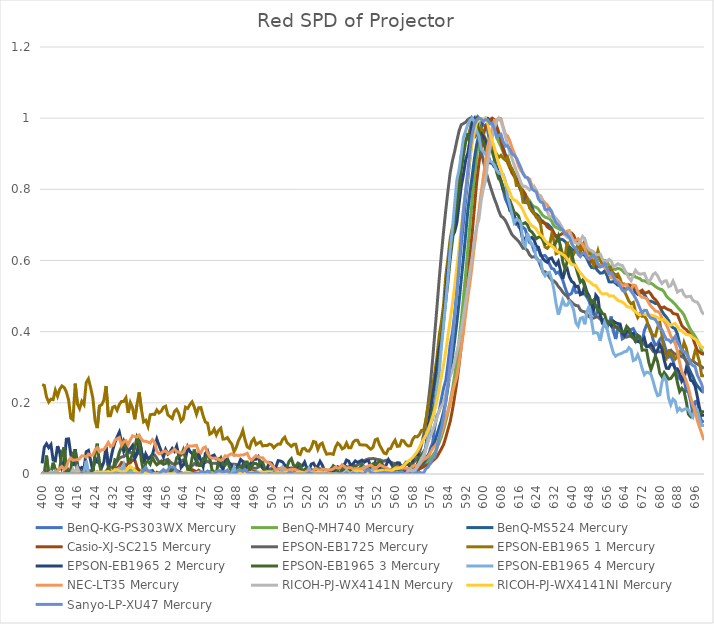
| Category | BenQ-KG-PS303WX | BenQ-MH740 | BenQ-MS524 | Casio-XJ-SC215 | EPSON-EB1725 | EPSON-EB1965 1 | EPSON-EB1965 2 | EPSON-EB1965 3 | EPSON-EB1965 4 | NEC-LT35 | RICOH-PJ-WX4141N | RICOH-PJ-WX4141NI | Sanyo-LP-XU47 |
|---|---|---|---|---|---|---|---|---|---|---|---|---|---|
| 400.0 | 0 | 0 | 0 | 0 | 0 | 0.251 | 0.03 | 0 | 0 | 0.006 | 0 | 0 | 0 |
| 401.0 | 0 | 0 | 0 | 0.001 | 0.006 | 0.249 | 0.076 | 0.003 | 0 | 0 | 0 | 0 | 0 |
| 402.0 | 0 | 0 | 0 | 0 | 0.008 | 0.217 | 0.085 | 0.052 | 0 | 0 | 0 | 0 | 0 |
| 403.0 | 0 | 0 | 0 | 0 | 0.006 | 0.202 | 0.074 | 0 | 0 | 0 | 0 | 0 | 0 |
| 404.0 | 0 | 0 | 0 | 0 | 0.002 | 0.21 | 0.083 | 0.004 | 0 | 0.003 | 0.007 | 0 | 0 |
| 405.0 | 0 | 0 | 0 | 0 | 0 | 0.209 | 0.039 | 0.032 | 0 | 0.004 | 0 | 0 | 0 |
| 406.0 | 0 | 0.005 | 0 | 0 | 0 | 0.235 | 0.037 | 0.012 | 0.009 | 0.004 | 0 | 0 | 0 |
| 407.0 | 0 | 0.003 | 0 | 0 | 0 | 0.219 | 0.078 | 0.009 | 0 | 0.007 | 0 | 0 | 0 |
| 408.0 | 0 | 0 | 0 | 0 | 0 | 0.238 | 0.06 | 0.015 | 0 | 0.016 | 0 | 0 | 0 |
| 409.0 | 0 | 0 | 0 | 0 | 0 | 0.248 | 0.018 | 0.06 | 0 | 0.021 | 0 | 0.001 | 0 |
| 410.0 | 0 | 0.005 | 0 | 0.003 | 0.002 | 0.243 | 0.03 | 0.075 | 0 | 0.013 | 0 | 0 | 0 |
| 411.0 | 0 | 0.01 | 0 | 0.006 | 0.005 | 0.231 | 0.098 | 0.009 | 0 | 0.019 | 0 | 0 | 0 |
| 412.0 | 0 | 0.002 | 0 | 0.006 | 0.013 | 0.208 | 0.099 | 0.005 | 0 | 0.038 | 0 | 0 | 0 |
| 413.0 | 0 | 0 | 0 | 0.001 | 0.006 | 0.157 | 0.056 | 0.011 | 0 | 0.044 | 0 | 0 | 0 |
| 414.0 | 0 | 0 | 0 | 0.001 | 0.008 | 0.152 | 0.022 | 0.059 | 0 | 0.038 | 0.013 | 0 | 0 |
| 415.0 | 0 | 0.001 | 0 | 0.006 | 0.006 | 0.254 | 0.07 | 0.063 | 0 | 0.04 | 0.001 | 0 | 0 |
| 416.0 | 0 | 0.009 | 0 | 0 | 0.005 | 0.197 | 0.023 | 0.001 | 0 | 0.04 | 0.018 | 0.003 | 0 |
| 417.0 | 0 | 0.009 | 0 | 0 | 0.004 | 0.184 | 0.014 | 0 | 0 | 0.043 | 0.003 | 0.002 | 0 |
| 418.0 | 0 | 0.003 | 0 | 0.009 | 0 | 0.204 | 0.019 | 0 | 0 | 0.051 | 0 | 0.002 | 0.003 |
| 419.0 | 0 | 0 | 0 | 0.012 | 0 | 0.195 | 0.014 | 0.001 | 0.007 | 0.051 | 0 | 0 | 0 |
| 420.0 | 0 | 0.005 | 0 | 0.008 | 0.005 | 0.257 | 0.062 | 0.025 | 0.037 | 0.047 | 0 | 0 | 0 |
| 421.0 | 0 | 0.007 | 0 | 0.004 | 0.004 | 0.268 | 0.066 | 0.009 | 0 | 0.056 | 0 | 0 | 0 |
| 422.0 | 0 | 0.009 | 0 | 0.001 | 0.009 | 0.243 | 0.037 | 0.005 | 0 | 0.052 | 0 | 0 | 0 |
| 423.0 | 0 | 0.007 | 0 | 0 | 0.004 | 0.214 | 0.009 | 0.007 | 0 | 0.053 | 0 | 0 | 0 |
| 424.0 | 0 | 0.004 | 0 | 0 | 0 | 0.151 | 0.046 | 0.056 | 0 | 0.067 | 0 | 0.005 | 0 |
| 425.0 | 0 | 0.007 | 0 | 0 | 0.001 | 0.129 | 0.033 | 0.085 | 0 | 0.074 | 0 | 0.006 | 0 |
| 426.0 | 0 | 0.002 | 0 | 0.002 | 0.005 | 0.191 | 0.032 | 0.027 | 0.001 | 0.063 | 0 | 0.005 | 0 |
| 427.0 | 0 | 0 | 0 | 0 | 0.002 | 0.194 | 0.018 | 0.002 | 0 | 0.068 | 0 | 0.006 | 0 |
| 428.0 | 0 | 0.001 | 0 | 0 | 0.001 | 0.208 | 0.034 | 0 | 0 | 0.068 | 0 | 0.005 | 0 |
| 429.0 | 0 | 0.009 | 0 | 0.004 | 0.004 | 0.247 | 0.076 | 0 | 0 | 0.078 | 0 | 0.006 | 0 |
| 430.0 | 0 | 0.008 | 0.001 | 0.005 | 0.015 | 0.164 | 0.021 | 0.018 | 0 | 0.089 | 0 | 0.007 | 0 |
| 431.0 | 0 | 0.005 | 0 | 0.001 | 0.02 | 0.164 | 0.039 | 0.005 | 0 | 0.077 | 0 | 0.005 | 0 |
| 432.0 | 0 | 0.006 | 0 | 0.006 | 0.018 | 0.188 | 0.067 | 0.006 | 0 | 0.08 | 0 | 0.007 | 0 |
| 433.0 | 0 | 0.006 | 0.002 | 0.015 | 0.022 | 0.19 | 0.089 | 0.04 | 0 | 0.095 | 0 | 0.012 | 0 |
| 434.0 | 0 | 0.006 | 0 | 0.017 | 0.036 | 0.179 | 0.104 | 0.038 | 0.012 | 0.099 | 0 | 0.012 | 0 |
| 435.0 | 0 | 0.008 | 0 | 0.021 | 0.044 | 0.195 | 0.118 | 0.061 | 0.016 | 0.102 | 0 | 0.009 | 0 |
| 436.0 | 0 | 0.005 | 0 | 0.032 | 0.048 | 0.204 | 0.09 | 0.076 | 0.011 | 0.08 | 0 | 0.006 | 0 |
| 437.0 | 0 | 0.003 | 0 | 0.03 | 0.049 | 0.204 | 0.064 | 0.093 | 0.027 | 0.09 | 0 | 0.005 | 0 |
| 438.0 | 0 | 0.005 | 0 | 0.023 | 0.053 | 0.214 | 0.078 | 0.078 | 0 | 0.094 | 0 | 0.009 | 0 |
| 439.0 | 0 | 0.011 | 0 | 0.03 | 0.058 | 0.171 | 0.064 | 0.036 | 0 | 0.082 | 0 | 0.016 | 0 |
| 440.0 | 0 | 0.01 | 0 | 0.032 | 0.061 | 0.201 | 0.071 | 0.04 | 0.005 | 0.096 | 0 | 0.021 | 0 |
| 441.0 | 0 | 0.01 | 0 | 0.039 | 0.058 | 0.186 | 0.08 | 0.057 | 0.002 | 0.107 | 0 | 0.016 | 0 |
| 442.0 | 0 | 0.014 | 0 | 0.04 | 0.058 | 0.154 | 0.043 | 0.072 | 0 | 0.105 | 0 | 0.01 | 0 |
| 443.0 | 0 | 0.015 | 0 | 0.02 | 0.06 | 0.194 | 0.055 | 0.104 | 0 | 0.104 | 0 | 0.004 | 0 |
| 444.0 | 0 | 0.012 | 0 | 0.007 | 0.059 | 0.229 | 0.098 | 0.092 | 0 | 0.109 | 0 | 0.002 | 0 |
| 445.0 | 0 | 0.006 | 0 | 0.002 | 0.054 | 0.182 | 0.067 | 0.038 | 0 | 0.098 | 0 | 0.004 | 0 |
| 446.0 | 0 | 0.004 | 0 | 0.002 | 0.054 | 0.147 | 0.029 | 0.005 | 0 | 0.092 | 0 | 0.003 | 0.011 |
| 447.0 | 0 | 0.004 | 0 | 0.01 | 0.047 | 0.151 | 0.056 | 0.031 | 0.003 | 0.092 | 0 | 0.003 | 0.019 |
| 448.0 | 0 | 0.003 | 0 | 0.006 | 0.043 | 0.134 | 0.043 | 0.036 | 0.009 | 0.09 | 0 | 0.003 | 0.008 |
| 449.0 | 0 | 0.009 | 0.005 | 0.005 | 0.048 | 0.167 | 0.045 | 0.027 | 0.007 | 0.087 | 0 | 0 | 0.007 |
| 450.0 | 0 | 0.01 | 0.009 | 0 | 0.055 | 0.168 | 0.053 | 0.047 | 0 | 0.096 | 0 | 0.001 | 0.001 |
| 451.0 | 0 | 0 | 0.001 | 0 | 0.054 | 0.168 | 0.078 | 0.034 | 0 | 0.09 | 0 | 0.002 | 0 |
| 452.0 | 0 | 0 | 0 | 0.005 | 0.044 | 0.18 | 0.098 | 0.026 | 0 | 0.064 | 0 | 0.002 | 0 |
| 453.0 | 0 | 0.003 | 0 | 0 | 0.034 | 0.172 | 0.08 | 0.031 | 0 | 0.057 | 0 | 0.001 | 0 |
| 454.0 | 0 | 0.006 | 0 | 0 | 0.031 | 0.176 | 0.065 | 0.036 | 0 | 0.058 | 0 | 0 | 0.006 |
| 455.0 | 0 | 0.007 | 0 | 0 | 0.037 | 0.187 | 0.048 | 0.027 | 0.001 | 0.064 | 0 | 0 | 0.013 |
| 456.0 | 0 | 0.005 | 0 | 0.001 | 0.039 | 0.191 | 0.069 | 0.029 | 0 | 0.065 | 0 | 0 | 0.007 |
| 457.0 | 0 | 0.003 | 0 | 0 | 0.041 | 0.166 | 0.056 | 0.037 | 0 | 0.057 | 0 | 0 | 0.011 |
| 458.0 | 0 | 0 | 0.001 | 0.005 | 0.034 | 0.161 | 0.062 | 0.015 | 0 | 0.059 | 0 | 0 | 0.021 |
| 459.0 | 0 | 0 | 0 | 0.014 | 0.029 | 0.156 | 0.072 | 0 | 0 | 0.064 | 0 | 0 | 0.019 |
| 460.0 | 0 | 0 | 0 | 0.003 | 0.028 | 0.175 | 0.064 | 0.018 | 0.006 | 0.07 | 0 | 0 | 0.019 |
| 461.0 | 0 | 0.005 | 0 | 0.01 | 0.03 | 0.182 | 0.079 | 0.046 | 0 | 0.064 | 0 | 0.001 | 0.008 |
| 462.0 | 0 | 0.006 | 0 | 0.007 | 0.031 | 0.17 | 0.051 | 0.051 | 0 | 0.061 | 0 | 0 | 0 |
| 463.0 | 0 | 0.005 | 0.001 | 0 | 0.036 | 0.148 | 0.018 | 0.053 | 0 | 0.058 | 0 | 0 | 0 |
| 464.0 | 0 | 0.001 | 0 | 0.001 | 0.04 | 0.156 | 0.026 | 0.068 | 0 | 0.06 | 0 | 0 | 0 |
| 465.0 | 0 | 0 | 0 | 0 | 0.026 | 0.188 | 0.043 | 0.043 | 0 | 0.072 | 0 | 0.005 | 0 |
| 466.0 | 0 | 0 | 0 | 0 | 0.022 | 0.184 | 0.076 | 0.012 | 0 | 0.079 | 0 | 0.005 | 0 |
| 467.0 | 0 | 0.005 | 0 | 0.004 | 0.022 | 0.195 | 0.063 | 0.009 | 0 | 0.078 | 0 | 0.004 | 0 |
| 468.0 | 0 | 0.007 | 0 | 0.012 | 0.022 | 0.203 | 0.057 | 0.046 | 0 | 0.079 | 0 | 0.001 | 0 |
| 469.0 | 0 | 0.006 | 0 | 0.009 | 0.029 | 0.188 | 0.048 | 0.069 | 0 | 0.079 | 0 | 0.001 | 0.002 |
| 470.0 | 0 | 0.004 | 0 | 0.006 | 0.025 | 0.168 | 0.035 | 0.041 | 0 | 0.081 | 0 | 0.003 | 0.003 |
| 471.0 | 0 | 0.003 | 0 | 0.01 | 0.029 | 0.186 | 0.057 | 0.024 | 0 | 0.064 | 0 | 0.005 | 0 |
| 472.0 | 0 | 0.005 | 0 | 0.006 | 0.028 | 0.187 | 0.037 | 0.024 | 0 | 0.059 | 0 | 0.004 | 0.007 |
| 473.0 | 0 | 0.006 | 0 | 0.002 | 0.029 | 0.163 | 0.021 | 0.042 | 0 | 0.073 | 0 | 0.003 | 0.005 |
| 474.0 | 0 | 0.005 | 0 | 0 | 0.032 | 0.146 | 0.058 | 0.04 | 0 | 0.076 | 0 | 0.002 | 0.003 |
| 475.0 | 0 | 0.006 | 0 | 0.002 | 0.036 | 0.143 | 0.065 | 0.055 | 0 | 0.059 | 0 | 0 | 0.008 |
| 476.0 | 0 | 0.007 | 0 | 0.001 | 0.032 | 0.112 | 0.045 | 0.046 | 0 | 0.049 | 0 | 0 | 0.002 |
| 477.0 | 0 | 0.008 | 0 | 0.001 | 0.03 | 0.116 | 0.05 | 0.012 | 0 | 0.044 | 0 | 0.003 | 0 |
| 478.0 | 0 | 0.007 | 0 | 0.002 | 0.03 | 0.126 | 0.053 | 0 | 0 | 0.044 | 0 | 0.001 | 0 |
| 479.0 | 0 | 0.003 | 0 | 0 | 0.03 | 0.11 | 0.042 | 0.003 | 0.001 | 0.045 | 0 | 0 | 0.006 |
| 480.0 | 0.002 | 0.003 | 0 | 0 | 0.025 | 0.122 | 0.043 | 0.037 | 0 | 0.041 | 0 | 0 | 0.01 |
| 481.0 | 0 | 0.009 | 0 | 0 | 0.021 | 0.129 | 0.028 | 0.046 | 0 | 0.038 | 0 | 0 | 0.008 |
| 482.0 | 0 | 0.008 | 0 | 0 | 0.028 | 0.098 | 0.012 | 0.027 | 0 | 0.042 | 0 | 0.001 | 0.005 |
| 483.0 | 0 | 0.005 | 0 | 0.001 | 0.029 | 0.099 | 0.038 | 0.025 | 0 | 0.051 | 0 | 0.001 | 0.007 |
| 484.0 | 0 | 0.004 | 0 | 0 | 0.03 | 0.102 | 0.043 | 0.037 | 0 | 0.05 | 0 | 0 | 0.011 |
| 485.0 | 0 | 0.004 | 0 | 0.001 | 0.029 | 0.092 | 0.029 | 0.018 | 0 | 0.055 | 0 | 0 | 0.001 |
| 486.0 | 0 | 0.005 | 0 | 0.003 | 0.027 | 0.084 | 0.025 | 0.007 | 0.003 | 0.057 | 0 | 0.001 | 0 |
| 487.0 | 0 | 0.007 | 0 | 0.004 | 0.028 | 0.063 | 0.005 | 0.011 | 0.018 | 0.052 | 0 | 0.001 | 0.002 |
| 488.0 | 0 | 0.007 | 0.001 | 0.006 | 0.027 | 0.074 | 0.015 | 0.011 | 0.002 | 0.053 | 0 | 0.002 | 0.004 |
| 489.0 | 0 | 0.004 | 0.006 | 0.006 | 0.025 | 0.094 | 0.026 | 0.019 | 0 | 0.052 | 0 | 0.004 | 0.011 |
| 490.0 | 0 | 0.002 | 0.006 | 0.006 | 0.023 | 0.106 | 0.041 | 0.021 | 0 | 0.053 | 0 | 0.003 | 0.01 |
| 491.0 | 0 | 0.007 | 0.007 | 0.008 | 0.024 | 0.122 | 0.036 | 0.011 | 0 | 0.053 | 0 | 0.002 | 0.007 |
| 492.0 | 0 | 0.007 | 0.007 | 0.01 | 0.023 | 0.096 | 0.006 | 0.034 | 0 | 0.055 | 0 | 0.003 | 0.013 |
| 493.0 | 0 | 0.006 | 0.004 | 0.008 | 0.025 | 0.076 | 0.024 | 0.034 | 0 | 0.058 | 0 | 0.003 | 0.006 |
| 494.0 | 0 | 0.005 | 0.005 | 0.008 | 0.022 | 0.072 | 0.025 | 0.014 | 0 | 0.044 | 0 | 0.004 | 0 |
| 495.0 | 0.001 | 0.006 | 0.007 | 0.01 | 0.016 | 0.091 | 0.034 | 0.021 | 0.006 | 0.039 | 0 | 0.004 | 0.002 |
| 496.0 | 0 | 0.008 | 0.006 | 0.006 | 0.017 | 0.099 | 0.041 | 0.03 | 0 | 0.046 | 0 | 0.003 | 0.001 |
| 497.0 | 0 | 0.007 | 0.003 | 0.005 | 0.016 | 0.083 | 0.042 | 0.029 | 0 | 0.052 | 0 | 0.001 | 0.005 |
| 498.0 | 0 | 0.005 | 0.002 | 0.002 | 0.019 | 0.087 | 0.049 | 0.024 | 0 | 0.048 | 0 | 0.004 | 0.003 |
| 499.0 | 0 | 0.003 | 0 | 0 | 0.023 | 0.09 | 0.029 | 0.036 | 0 | 0.045 | 0 | 0.007 | 0 |
| 500.0 | 0 | 0.002 | 0 | 0.003 | 0.017 | 0.079 | 0.017 | 0.032 | 0 | 0.046 | 0 | 0.005 | 0 |
| 501.0 | 0 | 0.004 | 0 | 0.001 | 0.013 | 0.08 | 0.007 | 0.015 | 0 | 0.038 | 0 | 0.005 | 0 |
| 502.0 | 0 | 0.004 | 0 | 0 | 0.012 | 0.08 | 0.016 | 0 | 0.003 | 0.033 | 0 | 0.006 | 0 |
| 503.0 | 0 | 0.005 | 0 | 0 | 0.013 | 0.084 | 0.032 | 0 | 0 | 0.031 | 0 | 0.006 | 0.002 |
| 504.0 | 0 | 0.007 | 0.001 | 0 | 0.015 | 0.082 | 0.03 | 0 | 0 | 0.025 | 0 | 0.004 | 0 |
| 505.0 | 0 | 0.006 | 0.005 | 0 | 0.015 | 0.074 | 0.018 | 0 | 0 | 0.019 | 0 | 0.002 | 0 |
| 506.0 | 0 | 0.004 | 0.001 | 0 | 0.013 | 0.08 | 0.02 | 0.003 | 0 | 0.011 | 0 | 0.003 | 0 |
| 507.0 | 0 | 0.004 | 0 | 0 | 0.015 | 0.084 | 0.038 | 0.009 | 0 | 0.012 | 0 | 0.004 | 0 |
| 508.0 | 0 | 0.003 | 0 | 0 | 0.015 | 0.084 | 0.037 | 0.014 | 0 | 0.016 | 0 | 0.002 | 0 |
| 509.0 | 0 | 0.001 | 0 | 0 | 0.013 | 0.097 | 0.034 | 0.003 | 0.019 | 0.016 | 0 | 0.002 | 0 |
| 510.0 | 0 | 0.002 | 0 | 0 | 0.014 | 0.103 | 0.025 | 0.009 | 0.003 | 0.015 | 0 | 0.004 | 0 |
| 511.0 | 0 | 0.004 | 0 | 0 | 0.012 | 0.089 | 0.02 | 0.02 | 0 | 0.01 | 0 | 0.005 | 0 |
| 512.0 | 0 | 0.003 | 0 | 0 | 0.016 | 0.083 | 0.014 | 0.036 | 0.002 | 0.012 | 0 | 0.004 | 0.004 |
| 513.0 | 0 | 0.003 | 0 | 0 | 0.017 | 0.077 | 0 | 0.043 | 0 | 0.013 | 0 | 0.003 | 0.003 |
| 514.0 | 0 | 0.003 | 0 | 0 | 0.015 | 0.083 | 0.003 | 0.024 | 0 | 0.013 | 0 | 0.003 | 0 |
| 515.0 | 0 | 0.004 | 0 | 0 | 0.017 | 0.084 | 0.015 | 0.021 | 0 | 0.012 | 0 | 0.003 | 0 |
| 516.0 | 0 | 0.005 | 0 | 0.001 | 0.016 | 0.057 | 0.024 | 0.031 | 0 | 0.008 | 0 | 0.005 | 0 |
| 517.0 | 0 | 0.003 | 0.001 | 0 | 0.01 | 0.055 | 0.022 | 0.027 | 0 | 0.006 | 0 | 0.005 | 0 |
| 518.0 | 0 | 0.001 | 0 | 0 | 0.007 | 0.071 | 0.023 | 0.004 | 0 | 0.005 | 0 | 0.004 | 0 |
| 519.0 | 0 | 0.003 | 0 | 0 | 0.008 | 0.072 | 0.033 | 0.013 | 0 | 0.004 | 0 | 0.002 | 0 |
| 520.0 | 0 | 0.004 | 0 | 0 | 0.012 | 0.065 | 0.016 | 0.017 | 0 | 0.008 | 0 | 0.003 | 0.001 |
| 521.0 | 0 | 0.002 | 0 | 0 | 0.014 | 0.064 | 0.011 | 0.012 | 0.016 | 0.006 | 0 | 0.005 | 0.004 |
| 522.0 | 0 | 0.002 | 0 | 0 | 0.012 | 0.074 | 0.028 | 0.008 | 0.005 | 0.004 | 0 | 0.004 | 0.002 |
| 523.0 | 0 | 0.003 | 0 | 0.001 | 0.011 | 0.091 | 0.03 | 0.006 | 0 | 0.009 | 0.001 | 0.002 | 0 |
| 524.0 | 0 | 0.004 | 0 | 0.001 | 0.012 | 0.089 | 0.02 | 0.017 | 0 | 0.016 | 0.003 | 0.003 | 0 |
| 525.0 | 0 | 0.004 | 0 | 0 | 0.016 | 0.069 | 0.022 | 0.004 | 0 | 0.012 | 0 | 0.005 | 0 |
| 526.0 | 0 | 0.002 | 0 | 0 | 0.015 | 0.083 | 0.035 | 0 | 0 | 0.009 | 0.004 | 0.004 | 0 |
| 527.0 | 0 | 0.002 | 0 | 0 | 0.011 | 0.087 | 0.025 | 0.011 | 0 | 0.013 | 0.004 | 0.003 | 0 |
| 528.0 | 0 | 0.004 | 0 | 0.001 | 0.011 | 0.069 | 0.009 | 0.003 | 0 | 0.013 | 0 | 0.004 | 0 |
| 529.0 | 0 | 0.005 | 0 | 0.004 | 0.011 | 0.056 | 0.001 | 0.002 | 0 | 0.011 | 0 | 0.003 | 0.001 |
| 530.0 | 0 | 0.004 | 0 | 0.002 | 0.01 | 0.057 | 0.007 | 0.002 | 0 | 0.012 | 0 | 0.002 | 0 |
| 531.0 | 0 | 0.004 | 0 | 0 | 0.012 | 0.057 | 0.014 | 0.013 | 0 | 0.012 | 0 | 0 | 0 |
| 532.0 | 0 | 0.004 | 0 | 0 | 0.013 | 0.055 | 0.003 | 0.023 | 0 | 0.014 | 0 | 0 | 0 |
| 533.0 | 0 | 0.003 | 0 | 0 | 0.015 | 0.076 | 0.017 | 0.019 | 0 | 0.02 | 0 | 0.001 | 0 |
| 534.0 | 0 | 0.003 | 0 | 0 | 0.018 | 0.087 | 0.02 | 0.008 | 0 | 0.017 | 0 | 0 | 0 |
| 535.0 | 0 | 0.004 | 0 | 0 | 0.017 | 0.081 | 0.017 | 0.003 | 0 | 0.017 | 0 | 0 | 0.002 |
| 536.0 | 0 | 0.004 | 0 | 0 | 0.016 | 0.071 | 0.024 | 0.012 | 0 | 0.026 | 0 | 0 | 0 |
| 537.0 | 0 | 0.004 | 0 | 0.001 | 0.022 | 0.074 | 0.026 | 0.01 | 0.002 | 0.021 | 0.003 | 0.003 | 0 |
| 538.0 | 0 | 0.006 | 0.001 | 0 | 0.02 | 0.087 | 0.039 | 0.019 | 0.005 | 0.016 | 0.01 | 0.005 | 0.004 |
| 539.0 | 0 | 0.007 | 0.004 | 0 | 0.019 | 0.073 | 0.036 | 0.014 | 0 | 0.018 | 0.001 | 0.003 | 0 |
| 540.0 | 0 | 0.008 | 0.003 | 0.001 | 0.026 | 0.074 | 0.022 | 0.012 | 0 | 0.018 | 0 | 0.002 | 0 |
| 541.0 | 0 | 0.006 | 0 | 0.002 | 0.025 | 0.089 | 0.029 | 0.02 | 0.003 | 0.014 | 0.001 | 0.006 | 0.003 |
| 542.0 | 0 | 0.004 | 0 | 0.001 | 0.023 | 0.095 | 0.037 | 0.021 | 0 | 0.015 | 0.002 | 0.008 | 0.001 |
| 543.0 | 0 | 0.006 | 0.005 | 0.001 | 0.025 | 0.095 | 0.033 | 0.014 | 0.001 | 0.015 | 0 | 0.008 | 0 |
| 544.0 | 0 | 0.007 | 0.008 | 0 | 0.029 | 0.082 | 0.036 | 0.016 | 0.004 | 0.014 | 0 | 0.008 | 0.002 |
| 545.0 | 0 | 0.006 | 0.004 | 0.002 | 0.034 | 0.082 | 0.039 | 0.027 | 0.015 | 0.016 | 0.007 | 0.006 | 0 |
| 546.0 | 0 | 0.005 | 0.002 | 0.008 | 0.037 | 0.081 | 0.033 | 0.02 | 0.02 | 0.017 | 0.002 | 0.004 | 0 |
| 547.0 | 0 | 0.005 | 0.005 | 0.009 | 0.041 | 0.081 | 0.037 | 0.014 | 0.001 | 0.019 | 0.003 | 0.003 | 0.011 |
| 548.0 | 0 | 0.006 | 0.007 | 0.009 | 0.043 | 0.075 | 0.037 | 0.014 | 0 | 0.023 | 0.001 | 0.006 | 0.012 |
| 549.0 | 0 | 0.007 | 0.008 | 0.004 | 0.043 | 0.07 | 0.02 | 0.022 | 0.004 | 0.025 | 0 | 0.006 | 0.004 |
| 550.0 | 0 | 0.007 | 0.008 | 0 | 0.044 | 0.075 | 0.019 | 0.029 | 0.014 | 0.02 | 0 | 0.005 | 0.002 |
| 551.0 | 0 | 0.008 | 0.007 | 0.004 | 0.042 | 0.096 | 0.033 | 0.028 | 0.014 | 0.016 | 0.006 | 0.007 | 0 |
| 552.0 | 0 | 0.01 | 0.01 | 0.005 | 0.041 | 0.099 | 0.021 | 0.031 | 0.003 | 0.02 | 0.002 | 0.008 | 0.002 |
| 553.0 | 0 | 0.009 | 0.009 | 0.003 | 0.04 | 0.081 | 0.013 | 0.035 | 0.003 | 0.025 | 0 | 0.009 | 0.003 |
| 554.0 | 0 | 0.008 | 0.008 | 0.003 | 0.038 | 0.07 | 0.018 | 0.032 | 0.001 | 0.023 | 0.003 | 0.011 | 0.003 |
| 555.0 | 0 | 0.009 | 0.009 | 0.005 | 0.036 | 0.059 | 0.018 | 0.014 | 0 | 0.02 | 0.002 | 0.009 | 0.005 |
| 556.0 | 0 | 0.009 | 0.01 | 0.005 | 0.039 | 0.057 | 0.026 | 0 | 0 | 0.018 | 0 | 0.01 | 0.004 |
| 557.0 | 0 | 0.008 | 0.008 | 0.004 | 0.038 | 0.07 | 0.04 | 0.003 | 0 | 0.014 | 0.003 | 0.009 | 0.003 |
| 558.0 | 0 | 0.008 | 0.004 | 0.002 | 0.034 | 0.071 | 0.031 | 0.01 | 0 | 0.01 | 0.001 | 0.007 | 0.002 |
| 559.0 | 0 | 0.008 | 0.005 | 0.003 | 0.031 | 0.085 | 0.021 | 0.016 | 0.007 | 0.012 | 0 | 0.011 | 0.002 |
| 560.0 | 0 | 0.008 | 0.007 | 0.004 | 0.029 | 0.095 | 0.023 | 0.026 | 0.002 | 0.017 | 0.003 | 0.015 | 0.005 |
| 561.0 | 0.003 | 0.008 | 0.008 | 0.004 | 0.026 | 0.078 | 0.032 | 0.013 | 0 | 0.02 | 0.004 | 0.015 | 0.002 |
| 562.0 | 0 | 0.009 | 0.008 | 0.005 | 0.021 | 0.079 | 0.031 | 0.01 | 0 | 0.017 | 0.003 | 0.017 | 0.005 |
| 563.0 | 0 | 0.009 | 0.007 | 0.003 | 0.02 | 0.094 | 0.018 | 0.018 | 0 | 0.017 | 0.003 | 0.02 | 0.006 |
| 564.0 | 0 | 0.011 | 0.008 | 0.006 | 0.025 | 0.093 | 0.021 | 0.024 | 0 | 0.018 | 0.001 | 0.024 | 0 |
| 565.0 | 0 | 0.011 | 0.007 | 0.008 | 0.029 | 0.083 | 0.029 | 0.033 | 0 | 0.017 | 0 | 0.031 | 0 |
| 566.0 | 0 | 0.01 | 0.008 | 0.006 | 0.026 | 0.079 | 0.027 | 0.033 | 0.011 | 0.014 | 0.008 | 0.036 | 0 |
| 567.0 | 0.001 | 0.011 | 0.014 | 0.006 | 0.026 | 0.08 | 0.017 | 0.027 | 0.01 | 0.016 | 0.011 | 0.041 | 0 |
| 568.0 | 0.011 | 0.012 | 0.013 | 0.005 | 0.031 | 0.097 | 0.037 | 0.029 | 0.004 | 0.022 | 0.009 | 0.047 | 0 |
| 569.0 | 0.004 | 0.014 | 0.015 | 0.001 | 0.036 | 0.105 | 0.053 | 0.021 | 0.004 | 0.024 | 0.013 | 0.054 | 0.001 |
| 570.0 | 0 | 0.016 | 0.02 | 0.005 | 0.044 | 0.104 | 0.056 | 0.025 | 0.023 | 0.023 | 0.018 | 0.063 | 0.002 |
| 571.0 | 0.018 | 0.018 | 0.022 | 0.015 | 0.06 | 0.111 | 0.054 | 0.046 | 0.03 | 0.026 | 0.031 | 0.074 | 0.005 |
| 572.0 | 0.027 | 0.021 | 0.027 | 0.017 | 0.082 | 0.122 | 0.048 | 0.054 | 0.042 | 0.034 | 0.044 | 0.087 | 0.003 |
| 573.0 | 0.029 | 0.024 | 0.032 | 0.02 | 0.111 | 0.123 | 0.047 | 0.063 | 0.056 | 0.041 | 0.049 | 0.098 | 0.003 |
| 574.0 | 0.026 | 0.029 | 0.042 | 0.025 | 0.149 | 0.154 | 0.078 | 0.073 | 0.075 | 0.044 | 0.069 | 0.109 | 0.015 |
| 575.0 | 0.042 | 0.034 | 0.054 | 0.025 | 0.199 | 0.191 | 0.135 | 0.094 | 0.106 | 0.049 | 0.092 | 0.124 | 0.02 |
| 576.0 | 0.072 | 0.043 | 0.064 | 0.03 | 0.253 | 0.215 | 0.178 | 0.142 | 0.138 | 0.06 | 0.107 | 0.141 | 0.031 |
| 577.0 | 0.087 | 0.052 | 0.076 | 0.037 | 0.32 | 0.246 | 0.219 | 0.177 | 0.153 | 0.072 | 0.122 | 0.159 | 0.042 |
| 578.0 | 0.131 | 0.06 | 0.09 | 0.042 | 0.394 | 0.284 | 0.258 | 0.202 | 0.185 | 0.078 | 0.139 | 0.18 | 0.049 |
| 579.0 | 0.164 | 0.074 | 0.111 | 0.049 | 0.47 | 0.329 | 0.305 | 0.251 | 0.243 | 0.087 | 0.159 | 0.205 | 0.073 |
| 580.0 | 0.177 | 0.088 | 0.131 | 0.059 | 0.547 | 0.388 | 0.353 | 0.313 | 0.282 | 0.1 | 0.177 | 0.237 | 0.105 |
| 581.0 | 0.21 | 0.104 | 0.15 | 0.071 | 0.617 | 0.427 | 0.378 | 0.37 | 0.357 | 0.116 | 0.19 | 0.273 | 0.129 |
| 582.0 | 0.241 | 0.124 | 0.175 | 0.083 | 0.682 | 0.477 | 0.431 | 0.433 | 0.418 | 0.137 | 0.2 | 0.307 | 0.161 |
| 583.0 | 0.263 | 0.147 | 0.205 | 0.103 | 0.742 | 0.557 | 0.513 | 0.487 | 0.484 | 0.161 | 0.225 | 0.346 | 0.204 |
| 584.0 | 0.311 | 0.174 | 0.244 | 0.126 | 0.797 | 0.607 | 0.579 | 0.54 | 0.556 | 0.178 | 0.256 | 0.39 | 0.253 |
| 585.0 | 0.364 | 0.204 | 0.287 | 0.148 | 0.847 | 0.662 | 0.635 | 0.603 | 0.631 | 0.198 | 0.275 | 0.433 | 0.311 |
| 586.0 | 0.398 | 0.237 | 0.328 | 0.18 | 0.88 | 0.692 | 0.669 | 0.656 | 0.689 | 0.228 | 0.292 | 0.478 | 0.373 |
| 587.0 | 0.449 | 0.276 | 0.374 | 0.218 | 0.906 | 0.71 | 0.68 | 0.713 | 0.758 | 0.253 | 0.315 | 0.528 | 0.441 |
| 588.0 | 0.516 | 0.322 | 0.425 | 0.258 | 0.936 | 0.761 | 0.706 | 0.755 | 0.826 | 0.274 | 0.343 | 0.581 | 0.508 |
| 589.0 | 0.583 | 0.375 | 0.483 | 0.305 | 0.964 | 0.829 | 0.758 | 0.795 | 0.854 | 0.312 | 0.37 | 0.633 | 0.587 |
| 590.0 | 0.645 | 0.433 | 0.545 | 0.358 | 0.982 | 0.894 | 0.808 | 0.856 | 0.899 | 0.356 | 0.405 | 0.693 | 0.672 |
| 591.0 | 0.705 | 0.495 | 0.607 | 0.413 | 0.985 | 0.921 | 0.842 | 0.895 | 0.946 | 0.398 | 0.443 | 0.746 | 0.741 |
| 592.0 | 0.769 | 0.563 | 0.673 | 0.47 | 0.988 | 0.937 | 0.882 | 0.932 | 0.964 | 0.449 | 0.481 | 0.792 | 0.798 |
| 593.0 | 0.828 | 0.634 | 0.741 | 0.541 | 0.996 | 0.946 | 0.902 | 0.958 | 0.983 | 0.496 | 0.527 | 0.844 | 0.852 |
| 594.0 | 0.89 | 0.705 | 0.793 | 0.613 | 1 | 0.969 | 0.94 | 0.932 | 0.994 | 0.539 | 0.573 | 0.891 | 0.911 |
| 595.0 | 0.945 | 0.773 | 0.839 | 0.679 | 0.992 | 1 | 0.992 | 0.943 | 1 | 0.589 | 0.611 | 0.928 | 0.955 |
| 596.0 | 0.946 | 0.835 | 0.888 | 0.75 | 0.98 | 0.992 | 1 | 0.99 | 0.989 | 0.642 | 0.663 | 0.962 | 0.983 |
| 597.0 | 0.959 | 0.894 | 0.926 | 0.82 | 0.963 | 0.959 | 0.976 | 1 | 0.964 | 0.691 | 0.695 | 0.988 | 0.995 |
| 598.0 | 1 | 0.938 | 0.952 | 0.872 | 0.937 | 0.956 | 0.956 | 0.962 | 0.95 | 0.739 | 0.715 | 0.994 | 1 |
| 599.0 | 0.993 | 0.972 | 0.975 | 0.914 | 0.909 | 0.972 | 0.958 | 0.938 | 0.914 | 0.79 | 0.766 | 0.996 | 0.998 |
| 600.0 | 0.979 | 0.994 | 0.993 | 0.952 | 0.88 | 0.955 | 0.949 | 0.935 | 0.905 | 0.834 | 0.801 | 0.999 | 0.991 |
| 601.0 | 0.98 | 1 | 1 | 0.976 | 0.855 | 0.942 | 0.937 | 0.911 | 0.899 | 0.88 | 0.824 | 1 | 0.996 |
| 602.0 | 0.964 | 0.998 | 1 | 0.988 | 0.833 | 0.929 | 0.902 | 0.899 | 0.884 | 0.922 | 0.874 | 0.986 | 0.995 |
| 603.0 | 0.93 | 0.986 | 0.995 | 0.995 | 0.812 | 0.923 | 0.874 | 0.909 | 0.879 | 0.943 | 0.914 | 0.956 | 0.985 |
| 604.0 | 0.915 | 0.981 | 0.992 | 1 | 0.792 | 0.927 | 0.874 | 0.908 | 0.877 | 0.972 | 0.945 | 0.937 | 0.986 |
| 605.0 | 0.893 | 0.97 | 0.987 | 0.996 | 0.774 | 0.909 | 0.863 | 0.884 | 0.868 | 0.994 | 0.972 | 0.919 | 0.971 |
| 606.0 | 0.861 | 0.946 | 0.973 | 0.979 | 0.758 | 0.9 | 0.864 | 0.849 | 0.854 | 0.995 | 0.989 | 0.892 | 0.949 |
| 607.0 | 0.84 | 0.933 | 0.957 | 0.96 | 0.74 | 0.89 | 0.844 | 0.829 | 0.846 | 1 | 1 | 0.872 | 0.951 |
| 608.0 | 0.82 | 0.921 | 0.94 | 0.937 | 0.724 | 0.896 | 0.824 | 0.825 | 0.843 | 0.999 | 0.992 | 0.856 | 0.954 |
| 609.0 | 0.798 | 0.905 | 0.917 | 0.91 | 0.72 | 0.888 | 0.799 | 0.807 | 0.842 | 0.976 | 0.971 | 0.837 | 0.934 |
| 610.0 | 0.773 | 0.89 | 0.898 | 0.893 | 0.712 | 0.882 | 0.788 | 0.789 | 0.824 | 0.955 | 0.949 | 0.82 | 0.921 |
| 611.0 | 0.759 | 0.874 | 0.887 | 0.878 | 0.699 | 0.89 | 0.774 | 0.775 | 0.781 | 0.95 | 0.925 | 0.807 | 0.923 |
| 612.0 | 0.744 | 0.86 | 0.87 | 0.863 | 0.686 | 0.866 | 0.744 | 0.769 | 0.755 | 0.936 | 0.903 | 0.792 | 0.913 |
| 613.0 | 0.73 | 0.85 | 0.853 | 0.846 | 0.673 | 0.858 | 0.749 | 0.753 | 0.731 | 0.917 | 0.887 | 0.776 | 0.9 |
| 614.0 | 0.725 | 0.845 | 0.841 | 0.836 | 0.666 | 0.844 | 0.726 | 0.735 | 0.706 | 0.902 | 0.869 | 0.77 | 0.896 |
| 615.0 | 0.71 | 0.833 | 0.826 | 0.83 | 0.66 | 0.811 | 0.705 | 0.732 | 0.715 | 0.885 | 0.852 | 0.767 | 0.889 |
| 616.0 | 0.695 | 0.817 | 0.812 | 0.814 | 0.654 | 0.811 | 0.713 | 0.725 | 0.713 | 0.866 | 0.837 | 0.76 | 0.874 |
| 617.0 | 0.688 | 0.801 | 0.796 | 0.805 | 0.645 | 0.807 | 0.684 | 0.702 | 0.706 | 0.853 | 0.819 | 0.753 | 0.861 |
| 618.0 | 0.693 | 0.79 | 0.779 | 0.796 | 0.635 | 0.764 | 0.655 | 0.703 | 0.652 | 0.847 | 0.808 | 0.741 | 0.844 |
| 619.0 | 0.688 | 0.782 | 0.768 | 0.787 | 0.634 | 0.763 | 0.663 | 0.706 | 0.64 | 0.836 | 0.809 | 0.728 | 0.834 |
| 620.0 | 0.666 | 0.775 | 0.762 | 0.771 | 0.628 | 0.772 | 0.67 | 0.7 | 0.676 | 0.832 | 0.804 | 0.716 | 0.833 |
| 621.0 | 0.651 | 0.768 | 0.763 | 0.751 | 0.616 | 0.747 | 0.662 | 0.685 | 0.657 | 0.829 | 0.798 | 0.705 | 0.82 |
| 622.0 | 0.646 | 0.757 | 0.751 | 0.739 | 0.609 | 0.741 | 0.665 | 0.68 | 0.645 | 0.812 | 0.803 | 0.697 | 0.801 |
| 623.0 | 0.627 | 0.751 | 0.734 | 0.731 | 0.611 | 0.733 | 0.658 | 0.672 | 0.64 | 0.802 | 0.808 | 0.694 | 0.797 |
| 624.0 | 0.63 | 0.75 | 0.73 | 0.727 | 0.608 | 0.721 | 0.641 | 0.661 | 0.606 | 0.798 | 0.797 | 0.689 | 0.793 |
| 625.0 | 0.632 | 0.744 | 0.725 | 0.713 | 0.6 | 0.721 | 0.637 | 0.666 | 0.598 | 0.784 | 0.779 | 0.677 | 0.773 |
| 626.0 | 0.614 | 0.735 | 0.715 | 0.706 | 0.585 | 0.7 | 0.617 | 0.667 | 0.6 | 0.781 | 0.781 | 0.672 | 0.764 |
| 627.0 | 0.613 | 0.727 | 0.707 | 0.71 | 0.569 | 0.659 | 0.605 | 0.658 | 0.567 | 0.769 | 0.767 | 0.666 | 0.762 |
| 628.0 | 0.614 | 0.722 | 0.704 | 0.704 | 0.568 | 0.638 | 0.599 | 0.647 | 0.557 | 0.762 | 0.745 | 0.656 | 0.744 |
| 629.0 | 0.606 | 0.72 | 0.703 | 0.694 | 0.563 | 0.634 | 0.595 | 0.65 | 0.565 | 0.756 | 0.737 | 0.649 | 0.742 |
| 630.0 | 0.59 | 0.718 | 0.697 | 0.69 | 0.553 | 0.642 | 0.605 | 0.645 | 0.567 | 0.743 | 0.723 | 0.645 | 0.747 |
| 631.0 | 0.578 | 0.71 | 0.69 | 0.686 | 0.545 | 0.674 | 0.607 | 0.642 | 0.547 | 0.734 | 0.722 | 0.642 | 0.738 |
| 632.0 | 0.576 | 0.697 | 0.677 | 0.677 | 0.543 | 0.656 | 0.595 | 0.642 | 0.519 | 0.723 | 0.725 | 0.636 | 0.717 |
| 633.0 | 0.564 | 0.693 | 0.666 | 0.669 | 0.537 | 0.619 | 0.587 | 0.651 | 0.478 | 0.713 | 0.718 | 0.627 | 0.704 |
| 634.0 | 0.567 | 0.69 | 0.662 | 0.67 | 0.527 | 0.621 | 0.597 | 0.668 | 0.448 | 0.701 | 0.711 | 0.624 | 0.699 |
| 635.0 | 0.558 | 0.686 | 0.66 | 0.673 | 0.52 | 0.639 | 0.572 | 0.638 | 0.468 | 0.691 | 0.701 | 0.621 | 0.691 |
| 636.0 | 0.545 | 0.687 | 0.659 | 0.676 | 0.511 | 0.617 | 0.549 | 0.597 | 0.489 | 0.685 | 0.689 | 0.617 | 0.686 |
| 637.0 | 0.525 | 0.679 | 0.654 | 0.673 | 0.504 | 0.608 | 0.573 | 0.576 | 0.474 | 0.68 | 0.672 | 0.613 | 0.676 |
| 638.0 | 0.508 | 0.669 | 0.645 | 0.675 | 0.499 | 0.652 | 0.577 | 0.596 | 0.474 | 0.683 | 0.666 | 0.605 | 0.672 |
| 639.0 | 0.503 | 0.666 | 0.638 | 0.677 | 0.489 | 0.623 | 0.554 | 0.64 | 0.486 | 0.684 | 0.677 | 0.596 | 0.665 |
| 640.0 | 0.508 | 0.664 | 0.632 | 0.677 | 0.484 | 0.606 | 0.542 | 0.622 | 0.477 | 0.668 | 0.665 | 0.588 | 0.648 |
| 641.0 | 0.525 | 0.662 | 0.629 | 0.67 | 0.477 | 0.618 | 0.537 | 0.594 | 0.46 | 0.655 | 0.652 | 0.588 | 0.638 |
| 642.0 | 0.51 | 0.657 | 0.628 | 0.653 | 0.474 | 0.629 | 0.526 | 0.581 | 0.424 | 0.657 | 0.649 | 0.585 | 0.634 |
| 643.0 | 0.511 | 0.65 | 0.622 | 0.65 | 0.473 | 0.648 | 0.528 | 0.559 | 0.415 | 0.661 | 0.646 | 0.574 | 0.617 |
| 644.0 | 0.511 | 0.65 | 0.616 | 0.643 | 0.461 | 0.624 | 0.504 | 0.539 | 0.437 | 0.652 | 0.654 | 0.565 | 0.611 |
| 645.0 | 0.508 | 0.648 | 0.617 | 0.632 | 0.457 | 0.642 | 0.506 | 0.546 | 0.44 | 0.646 | 0.668 | 0.558 | 0.62 |
| 646.0 | 0.505 | 0.639 | 0.615 | 0.625 | 0.456 | 0.654 | 0.531 | 0.525 | 0.421 | 0.635 | 0.661 | 0.551 | 0.622 |
| 647.0 | 0.497 | 0.634 | 0.605 | 0.613 | 0.448 | 0.615 | 0.511 | 0.499 | 0.456 | 0.615 | 0.639 | 0.544 | 0.607 |
| 648.0 | 0.485 | 0.626 | 0.591 | 0.602 | 0.442 | 0.62 | 0.5 | 0.498 | 0.472 | 0.608 | 0.631 | 0.541 | 0.604 |
| 649.0 | 0.464 | 0.62 | 0.581 | 0.596 | 0.439 | 0.615 | 0.477 | 0.481 | 0.433 | 0.609 | 0.628 | 0.536 | 0.612 |
| 650.0 | 0.448 | 0.623 | 0.581 | 0.593 | 0.438 | 0.587 | 0.462 | 0.488 | 0.396 | 0.616 | 0.623 | 0.53 | 0.615 |
| 651.0 | 0.445 | 0.618 | 0.578 | 0.586 | 0.441 | 0.604 | 0.503 | 0.473 | 0.398 | 0.607 | 0.615 | 0.53 | 0.607 |
| 652.0 | 0.467 | 0.604 | 0.57 | 0.583 | 0.441 | 0.628 | 0.495 | 0.458 | 0.395 | 0.591 | 0.616 | 0.52 | 0.589 |
| 653.0 | 0.448 | 0.599 | 0.564 | 0.588 | 0.435 | 0.606 | 0.446 | 0.462 | 0.374 | 0.587 | 0.618 | 0.511 | 0.582 |
| 654.0 | 0.427 | 0.6 | 0.565 | 0.587 | 0.433 | 0.586 | 0.423 | 0.451 | 0.407 | 0.585 | 0.604 | 0.506 | 0.585 |
| 655.0 | 0.429 | 0.6 | 0.571 | 0.583 | 0.435 | 0.592 | 0.417 | 0.448 | 0.426 | 0.58 | 0.595 | 0.507 | 0.591 |
| 656.0 | 0.41 | 0.597 | 0.559 | 0.581 | 0.426 | 0.573 | 0.428 | 0.428 | 0.411 | 0.575 | 0.598 | 0.507 | 0.58 |
| 657.0 | 0.425 | 0.586 | 0.54 | 0.574 | 0.421 | 0.581 | 0.427 | 0.424 | 0.383 | 0.562 | 0.603 | 0.501 | 0.564 |
| 658.0 | 0.443 | 0.582 | 0.539 | 0.569 | 0.42 | 0.581 | 0.416 | 0.431 | 0.361 | 0.551 | 0.598 | 0.501 | 0.566 |
| 659.0 | 0.4 | 0.576 | 0.541 | 0.565 | 0.412 | 0.557 | 0.429 | 0.421 | 0.339 | 0.55 | 0.583 | 0.5 | 0.554 |
| 660.0 | 0.379 | 0.575 | 0.536 | 0.558 | 0.412 | 0.559 | 0.425 | 0.414 | 0.331 | 0.547 | 0.586 | 0.494 | 0.54 |
| 661.0 | 0.412 | 0.578 | 0.53 | 0.551 | 0.414 | 0.562 | 0.423 | 0.41 | 0.336 | 0.545 | 0.591 | 0.488 | 0.539 |
| 662.0 | 0.414 | 0.576 | 0.531 | 0.54 | 0.409 | 0.55 | 0.421 | 0.403 | 0.337 | 0.537 | 0.587 | 0.485 | 0.528 |
| 663.0 | 0.38 | 0.572 | 0.526 | 0.533 | 0.396 | 0.526 | 0.397 | 0.4 | 0.34 | 0.529 | 0.586 | 0.484 | 0.516 |
| 664.0 | 0.384 | 0.565 | 0.519 | 0.534 | 0.386 | 0.513 | 0.389 | 0.399 | 0.344 | 0.532 | 0.574 | 0.479 | 0.512 |
| 665.0 | 0.395 | 0.563 | 0.521 | 0.53 | 0.385 | 0.5 | 0.401 | 0.415 | 0.345 | 0.533 | 0.564 | 0.471 | 0.519 |
| 666.0 | 0.395 | 0.561 | 0.523 | 0.532 | 0.387 | 0.486 | 0.402 | 0.408 | 0.355 | 0.52 | 0.551 | 0.469 | 0.523 |
| 667.0 | 0.406 | 0.56 | 0.524 | 0.529 | 0.386 | 0.478 | 0.394 | 0.39 | 0.349 | 0.519 | 0.543 | 0.468 | 0.513 |
| 668.0 | 0.409 | 0.56 | 0.522 | 0.523 | 0.382 | 0.482 | 0.395 | 0.383 | 0.319 | 0.531 | 0.559 | 0.461 | 0.505 |
| 669.0 | 0.396 | 0.554 | 0.51 | 0.523 | 0.379 | 0.456 | 0.373 | 0.373 | 0.322 | 0.529 | 0.573 | 0.456 | 0.494 |
| 670.0 | 0.388 | 0.551 | 0.505 | 0.512 | 0.372 | 0.44 | 0.373 | 0.39 | 0.335 | 0.514 | 0.565 | 0.451 | 0.482 |
| 671.0 | 0.372 | 0.549 | 0.51 | 0.513 | 0.372 | 0.45 | 0.37 | 0.386 | 0.32 | 0.501 | 0.562 | 0.447 | 0.466 |
| 672.0 | 0.372 | 0.543 | 0.509 | 0.517 | 0.37 | 0.443 | 0.375 | 0.348 | 0.296 | 0.497 | 0.562 | 0.451 | 0.453 |
| 673.0 | 0.403 | 0.543 | 0.505 | 0.509 | 0.365 | 0.444 | 0.382 | 0.348 | 0.279 | 0.496 | 0.564 | 0.449 | 0.46 |
| 674.0 | 0.419 | 0.54 | 0.494 | 0.509 | 0.358 | 0.435 | 0.358 | 0.349 | 0.286 | 0.493 | 0.549 | 0.447 | 0.459 |
| 675.0 | 0.417 | 0.536 | 0.485 | 0.513 | 0.359 | 0.413 | 0.359 | 0.314 | 0.285 | 0.481 | 0.538 | 0.447 | 0.445 |
| 676.0 | 0.403 | 0.536 | 0.486 | 0.506 | 0.354 | 0.397 | 0.366 | 0.293 | 0.28 | 0.471 | 0.549 | 0.447 | 0.438 |
| 677.0 | 0.377 | 0.532 | 0.483 | 0.496 | 0.345 | 0.39 | 0.357 | 0.311 | 0.26 | 0.465 | 0.561 | 0.445 | 0.437 |
| 678.0 | 0.362 | 0.527 | 0.479 | 0.49 | 0.345 | 0.388 | 0.337 | 0.332 | 0.237 | 0.457 | 0.565 | 0.443 | 0.434 |
| 679.0 | 0.365 | 0.523 | 0.48 | 0.482 | 0.343 | 0.412 | 0.349 | 0.316 | 0.22 | 0.457 | 0.557 | 0.44 | 0.423 |
| 680.0 | 0.378 | 0.52 | 0.47 | 0.47 | 0.343 | 0.427 | 0.364 | 0.283 | 0.222 | 0.453 | 0.544 | 0.434 | 0.41 |
| 681.0 | 0.385 | 0.518 | 0.457 | 0.466 | 0.343 | 0.391 | 0.35 | 0.273 | 0.259 | 0.439 | 0.535 | 0.434 | 0.405 |
| 682.0 | 0.366 | 0.511 | 0.448 | 0.469 | 0.339 | 0.331 | 0.32 | 0.285 | 0.273 | 0.429 | 0.542 | 0.436 | 0.39 |
| 683.0 | 0.344 | 0.5 | 0.441 | 0.465 | 0.338 | 0.324 | 0.297 | 0.277 | 0.26 | 0.419 | 0.543 | 0.43 | 0.378 |
| 684.0 | 0.329 | 0.493 | 0.431 | 0.462 | 0.346 | 0.343 | 0.297 | 0.267 | 0.213 | 0.404 | 0.526 | 0.422 | 0.377 |
| 685.0 | 0.331 | 0.488 | 0.417 | 0.46 | 0.348 | 0.336 | 0.309 | 0.268 | 0.195 | 0.388 | 0.529 | 0.418 | 0.37 |
| 686.0 | 0.318 | 0.483 | 0.411 | 0.451 | 0.341 | 0.334 | 0.309 | 0.277 | 0.21 | 0.377 | 0.542 | 0.421 | 0.378 |
| 687.0 | 0.294 | 0.477 | 0.408 | 0.45 | 0.337 | 0.323 | 0.297 | 0.287 | 0.204 | 0.366 | 0.528 | 0.423 | 0.387 |
| 688.0 | 0.277 | 0.469 | 0.393 | 0.448 | 0.336 | 0.33 | 0.296 | 0.257 | 0.177 | 0.346 | 0.511 | 0.414 | 0.372 |
| 689.0 | 0.268 | 0.462 | 0.367 | 0.433 | 0.333 | 0.343 | 0.284 | 0.232 | 0.185 | 0.314 | 0.516 | 0.405 | 0.359 |
| 690.0 | 0.273 | 0.456 | 0.343 | 0.417 | 0.329 | 0.341 | 0.26 | 0.241 | 0.178 | 0.286 | 0.517 | 0.402 | 0.349 |
| 691.0 | 0.266 | 0.446 | 0.331 | 0.41 | 0.327 | 0.37 | 0.269 | 0.233 | 0.181 | 0.277 | 0.504 | 0.396 | 0.343 |
| 692.0 | 0.233 | 0.432 | 0.317 | 0.406 | 0.317 | 0.354 | 0.297 | 0.204 | 0.184 | 0.262 | 0.497 | 0.392 | 0.339 |
| 693.0 | 0.231 | 0.417 | 0.299 | 0.398 | 0.309 | 0.325 | 0.285 | 0.168 | 0.18 | 0.241 | 0.499 | 0.391 | 0.328 |
| 694.0 | 0.205 | 0.405 | 0.286 | 0.391 | 0.317 | 0.318 | 0.263 | 0.161 | 0.169 | 0.216 | 0.5 | 0.389 | 0.31 |
| 695.0 | 0.169 | 0.397 | 0.273 | 0.382 | 0.318 | 0.319 | 0.26 | 0.175 | 0.16 | 0.193 | 0.488 | 0.383 | 0.305 |
| 696.0 | 0.203 | 0.387 | 0.258 | 0.364 | 0.312 | 0.345 | 0.247 | 0.178 | 0.187 | 0.176 | 0.484 | 0.379 | 0.302 |
| 697.0 | 0.205 | 0.376 | 0.248 | 0.348 | 0.309 | 0.337 | 0.218 | 0.168 | 0.181 | 0.15 | 0.483 | 0.374 | 0.278 |
| 698.0 | 0.17 | 0.364 | 0.241 | 0.343 | 0.305 | 0.315 | 0.185 | 0.165 | 0.155 | 0.132 | 0.473 | 0.365 | 0.265 |
| 699.0 | 0.146 | 0.345 | 0.233 | 0.338 | 0.301 | 0.276 | 0.165 | 0.175 | 0.136 | 0.114 | 0.456 | 0.356 | 0.252 |
| 700.0 | 0.15 | 0.334 | 0.229 | 0.338 | 0.296 | 0.276 | 0.165 | 0.175 | 0.136 | 0.095 | 0.448 | 0.356 | 0.228 |